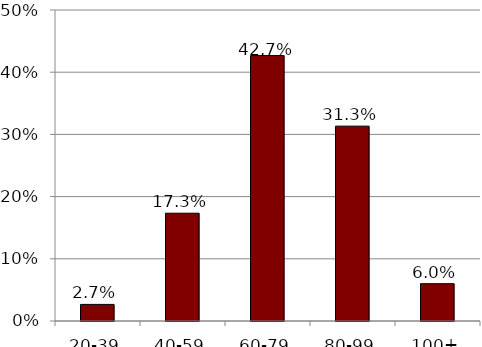
| Category | Series 1 |
|---|---|
| 20-39 | 0.027 |
| 40-59 | 0.173 |
| 60-79 | 0.427 |
| 80-99 | 0.313 |
| 100+ | 0.06 |